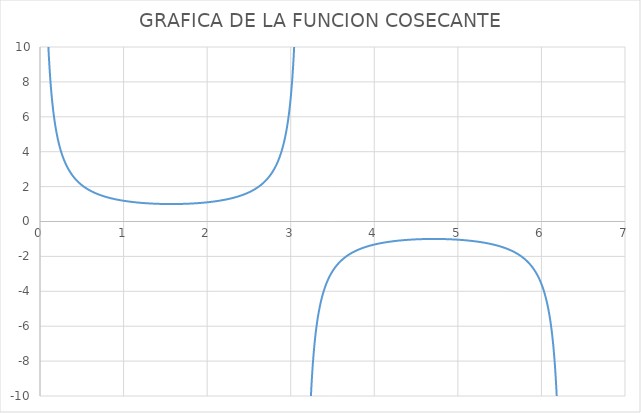
| Category | Series 0 |
|---|---|
| 0.017453292519943295 | 57.299 |
| 0.03490658503988659 | 28.654 |
| 0.05235987755982989 | 19.107 |
| 0.06981317007977318 | 14.336 |
| 0.08726646259971647 | 11.474 |
| 0.10471975511965978 | 9.567 |
| 0.12217304763960307 | 8.206 |
| 0.13962634015954636 | 7.185 |
| 0.15707963267948966 | 6.392 |
| 0.17453292519943295 | 5.759 |
| 0.19198621771937624 | 5.241 |
| 0.20943951023931956 | 4.81 |
| 0.22689280275926285 | 4.445 |
| 0.24434609527920614 | 4.134 |
| 0.2617993877991494 | 3.864 |
| 0.2792526803190927 | 3.628 |
| 0.29670597283903605 | 3.42 |
| 0.3141592653589793 | 3.236 |
| 0.33161255787892263 | 3.072 |
| 0.3490658503988659 | 2.924 |
| 0.3665191429188092 | 2.79 |
| 0.3839724354387525 | 2.669 |
| 0.4014257279586958 | 2.559 |
| 0.4188790204786391 | 2.459 |
| 0.4363323129985824 | 2.366 |
| 0.4537856055185257 | 2.281 |
| 0.47123889803846897 | 2.203 |
| 0.4886921905584123 | 2.13 |
| 0.5061454830783556 | 2.063 |
| 0.5235987755982988 | 2 |
| 0.5410520681182421 | 1.942 |
| 0.5585053606381855 | 1.887 |
| 0.5759586531581288 | 1.836 |
| 0.5934119456780721 | 1.788 |
| 0.6108652381980153 | 1.743 |
| 0.6283185307179586 | 1.701 |
| 0.6457718232379019 | 1.662 |
| 0.6632251157578453 | 1.624 |
| 0.6806784082777885 | 1.589 |
| 0.6981317007977318 | 1.556 |
| 0.7155849933176751 | 1.524 |
| 0.7330382858376184 | 1.494 |
| 0.7504915783575618 | 1.466 |
| 0.767944870877505 | 1.44 |
| 0.7853981633974483 | 1.414 |
| 0.8028514559173916 | 1.39 |
| 0.8203047484373349 | 1.367 |
| 0.8377580409572782 | 1.346 |
| 0.8552113334772214 | 1.325 |
| 0.8726646259971648 | 1.305 |
| 0.8901179185171081 | 1.287 |
| 0.9075712110370514 | 1.269 |
| 0.9250245035569946 | 1.252 |
| 0.9424777960769379 | 1.236 |
| 0.9599310885968813 | 1.221 |
| 0.9773843811168246 | 1.206 |
| 0.9948376736367679 | 1.192 |
| 1.0122909661567112 | 1.179 |
| 1.0297442586766545 | 1.167 |
| 1.0471975511965976 | 1.155 |
| 1.064650843716541 | 1.143 |
| 1.0821041362364843 | 1.133 |
| 1.0995574287564276 | 1.122 |
| 1.117010721276371 | 1.113 |
| 1.1344640137963142 | 1.103 |
| 1.1519173063162575 | 1.095 |
| 1.1693705988362009 | 1.086 |
| 1.1868238913561442 | 1.079 |
| 1.2042771838760873 | 1.071 |
| 1.2217304763960306 | 1.064 |
| 1.239183768915974 | 1.058 |
| 1.2566370614359172 | 1.051 |
| 1.2740903539558606 | 1.046 |
| 1.2915436464758039 | 1.04 |
| 1.3089969389957472 | 1.035 |
| 1.3264502315156905 | 1.031 |
| 1.3439035240356338 | 1.026 |
| 1.361356816555577 | 1.022 |
| 1.3788101090755203 | 1.019 |
| 1.3962634015954636 | 1.015 |
| 1.413716694115407 | 1.012 |
| 1.4311699866353502 | 1.01 |
| 1.4486232791552935 | 1.008 |
| 1.4660765716752369 | 1.006 |
| 1.4835298641951802 | 1.004 |
| 1.5009831567151235 | 1.002 |
| 1.5184364492350666 | 1.001 |
| 1.53588974175501 | 1.001 |
| 1.5533430342749532 | 1 |
| 1.5707963267948966 | 1 |
| 1.5882496193148399 | 1 |
| 1.6057029118347832 | 1.001 |
| 1.6231562043547265 | 1.001 |
| 1.6406094968746698 | 1.002 |
| 1.6580627893946132 | 1.004 |
| 1.6755160819145565 | 1.006 |
| 1.6929693744344996 | 1.008 |
| 1.710422666954443 | 1.01 |
| 1.7278759594743862 | 1.012 |
| 1.7453292519943295 | 1.015 |
| 1.7627825445142729 | 1.019 |
| 1.7802358370342162 | 1.022 |
| 1.7976891295541595 | 1.026 |
| 1.8151424220741028 | 1.031 |
| 1.8325957145940461 | 1.035 |
| 1.8500490071139892 | 1.04 |
| 1.8675022996339325 | 1.046 |
| 1.8849555921538759 | 1.051 |
| 1.9024088846738192 | 1.058 |
| 1.9198621771937625 | 1.064 |
| 1.9373154697137058 | 1.071 |
| 1.9547687622336491 | 1.079 |
| 1.9722220547535925 | 1.086 |
| 1.9896753472735358 | 1.095 |
| 2.007128639793479 | 1.103 |
| 2.0245819323134224 | 1.113 |
| 2.0420352248333655 | 1.122 |
| 2.059488517353309 | 1.133 |
| 2.076941809873252 | 1.143 |
| 2.0943951023931953 | 1.155 |
| 2.111848394913139 | 1.167 |
| 2.129301687433082 | 1.179 |
| 2.1467549799530254 | 1.192 |
| 2.1642082724729685 | 1.206 |
| 2.181661564992912 | 1.221 |
| 2.199114857512855 | 1.236 |
| 2.2165681500327987 | 1.252 |
| 2.234021442552742 | 1.269 |
| 2.251474735072685 | 1.287 |
| 2.2689280275926285 | 1.305 |
| 2.2863813201125716 | 1.325 |
| 2.303834612632515 | 1.346 |
| 2.321287905152458 | 1.367 |
| 2.3387411976724017 | 1.39 |
| 2.356194490192345 | 1.414 |
| 2.3736477827122884 | 1.44 |
| 2.3911010752322315 | 1.466 |
| 2.4085543677521746 | 1.494 |
| 2.426007660272118 | 1.524 |
| 2.443460952792061 | 1.556 |
| 2.4609142453120048 | 1.589 |
| 2.478367537831948 | 1.624 |
| 2.4958208303518914 | 1.662 |
| 2.5132741228718345 | 1.701 |
| 2.530727415391778 | 1.743 |
| 2.548180707911721 | 1.788 |
| 2.5656340004316642 | 1.836 |
| 2.5830872929516078 | 1.887 |
| 2.600540585471551 | 1.942 |
| 2.6179938779914944 | 2 |
| 2.6354471705114375 | 2.063 |
| 2.652900463031381 | 2.13 |
| 2.670353755551324 | 2.203 |
| 2.6878070480712677 | 2.281 |
| 2.705260340591211 | 2.366 |
| 2.722713633111154 | 2.459 |
| 2.7401669256310974 | 2.559 |
| 2.7576202181510405 | 2.669 |
| 2.775073510670984 | 2.79 |
| 2.792526803190927 | 2.924 |
| 2.8099800957108707 | 3.072 |
| 2.827433388230814 | 3.236 |
| 2.8448866807507573 | 3.42 |
| 2.8623399732707004 | 3.628 |
| 2.8797932657906435 | 3.864 |
| 2.897246558310587 | 4.134 |
| 2.91469985083053 | 4.445 |
| 2.9321531433504737 | 4.81 |
| 2.949606435870417 | 5.241 |
| 2.9670597283903604 | 5.759 |
| 2.9845130209103035 | 6.392 |
| 3.001966313430247 | 7.185 |
| 3.01941960595019 | 8.206 |
| 3.036872898470133 | 9.567 |
| 3.0543261909900767 | 11.474 |
| 3.07177948351002 | 14.336 |
| 3.0892327760299634 | 19.107 |
| 3.1066860685499065 | 28.654 |
| 3.12413936106985 | 57.299 |
| 3.141592653589793 | 8162276138809537 |
| 3.1590459461097367 | -57.299 |
| 3.1764992386296798 | -28.654 |
| 3.193952531149623 | -19.107 |
| 3.2114058236695664 | -14.336 |
| 3.2288591161895095 | -11.474 |
| 3.246312408709453 | -9.567 |
| 3.263765701229396 | -8.206 |
| 3.2812189937493397 | -7.185 |
| 3.2986722862692828 | -6.392 |
| 3.3161255787892263 | -5.759 |
| 3.3335788713091694 | -5.241 |
| 3.351032163829113 | -4.81 |
| 3.368485456349056 | -4.445 |
| 3.385938748868999 | -4.134 |
| 3.4033920413889427 | -3.864 |
| 3.420845333908886 | -3.628 |
| 3.4382986264288293 | -3.42 |
| 3.4557519189487724 | -3.236 |
| 3.473205211468716 | -3.072 |
| 3.490658503988659 | -2.924 |
| 3.5081117965086026 | -2.79 |
| 3.5255650890285457 | -2.669 |
| 3.543018381548489 | -2.559 |
| 3.5604716740684323 | -2.459 |
| 3.5779249665883754 | -2.366 |
| 3.595378259108319 | -2.281 |
| 3.612831551628262 | -2.203 |
| 3.6302848441482056 | -2.13 |
| 3.6477381366681487 | -2.063 |
| 3.6651914291880923 | -2 |
| 3.6826447217080354 | -1.942 |
| 3.7000980142279785 | -1.887 |
| 3.717551306747922 | -1.836 |
| 3.735004599267865 | -1.788 |
| 3.7524578917878086 | -1.743 |
| 3.7699111843077517 | -1.701 |
| 3.7873644768276953 | -1.662 |
| 3.8048177693476384 | -1.624 |
| 3.822271061867582 | -1.589 |
| 3.839724354387525 | -1.556 |
| 3.857177646907468 | -1.524 |
| 3.8746309394274117 | -1.494 |
| 3.8920842319473548 | -1.466 |
| 3.9095375244672983 | -1.44 |
| 3.9269908169872414 | -1.414 |
| 3.944444109507185 | -1.39 |
| 3.961897402027128 | -1.367 |
| 3.9793506945470716 | -1.346 |
| 3.9968039870670147 | -1.325 |
| 4.014257279586958 | -1.305 |
| 4.031710572106901 | -1.287 |
| 4.049163864626845 | -1.269 |
| 4.066617157146788 | -1.252 |
| 4.084070449666731 | -1.236 |
| 4.101523742186674 | -1.221 |
| 4.118977034706618 | -1.206 |
| 4.136430327226561 | -1.192 |
| 4.153883619746504 | -1.179 |
| 4.171336912266447 | -1.167 |
| 4.1887902047863905 | -1.155 |
| 4.2062434973063345 | -1.143 |
| 4.223696789826278 | -1.133 |
| 4.241150082346221 | -1.122 |
| 4.258603374866164 | -1.113 |
| 4.276056667386108 | -1.103 |
| 4.293509959906051 | -1.095 |
| 4.310963252425994 | -1.086 |
| 4.328416544945937 | -1.079 |
| 4.34586983746588 | -1.071 |
| 4.363323129985824 | -1.064 |
| 4.380776422505767 | -1.058 |
| 4.39822971502571 | -1.051 |
| 4.4156830075456535 | -1.046 |
| 4.4331363000655974 | -1.04 |
| 4.4505895925855405 | -1.035 |
| 4.468042885105484 | -1.031 |
| 4.485496177625427 | -1.026 |
| 4.50294947014537 | -1.022 |
| 4.520402762665314 | -1.019 |
| 4.537856055185257 | -1.015 |
| 4.5553093477052 | -1.012 |
| 4.572762640225143 | -1.01 |
| 4.590215932745087 | -1.008 |
| 4.60766922526503 | -1.006 |
| 4.625122517784973 | -1.004 |
| 4.642575810304916 | -1.002 |
| 4.6600291028248595 | -1.001 |
| 4.6774823953448035 | -1.001 |
| 4.694935687864747 | -1 |
| 4.71238898038469 | -1 |
| 4.729842272904633 | -1 |
| 4.747295565424577 | -1.001 |
| 4.76474885794452 | -1.001 |
| 4.782202150464463 | -1.002 |
| 4.799655442984406 | -1.004 |
| 4.817108735504349 | -1.006 |
| 4.834562028024293 | -1.008 |
| 4.852015320544236 | -1.01 |
| 4.869468613064179 | -1.012 |
| 4.886921905584122 | -1.015 |
| 4.904375198104066 | -1.019 |
| 4.9218284906240095 | -1.022 |
| 4.939281783143953 | -1.026 |
| 4.956735075663896 | -1.031 |
| 4.974188368183839 | -1.035 |
| 4.991641660703783 | -1.04 |
| 5.009094953223726 | -1.046 |
| 5.026548245743669 | -1.051 |
| 5.044001538263612 | -1.058 |
| 5.061454830783556 | -1.064 |
| 5.078908123303499 | -1.071 |
| 5.096361415823442 | -1.079 |
| 5.113814708343385 | -1.086 |
| 5.1312680008633285 | -1.095 |
| 5.1487212933832724 | -1.103 |
| 5.1661745859032155 | -1.113 |
| 5.183627878423159 | -1.122 |
| 5.201081170943102 | -1.133 |
| 5.218534463463046 | -1.143 |
| 5.235987755982989 | -1.155 |
| 5.253441048502932 | -1.167 |
| 5.270894341022875 | -1.179 |
| 5.288347633542818 | -1.192 |
| 5.305800926062762 | -1.206 |
| 5.323254218582705 | -1.221 |
| 5.340707511102648 | -1.236 |
| 5.358160803622591 | -1.252 |
| 5.375614096142535 | -1.269 |
| 5.3930673886624785 | -1.287 |
| 5.410520681182422 | -1.305 |
| 5.427973973702365 | -1.325 |
| 5.445427266222308 | -1.346 |
| 5.462880558742252 | -1.367 |
| 5.480333851262195 | -1.39 |
| 5.497787143782138 | -1.414 |
| 5.515240436302081 | -1.44 |
| 5.532693728822025 | -1.466 |
| 5.550147021341968 | -1.494 |
| 5.567600313861911 | -1.524 |
| 5.585053606381854 | -1.556 |
| 5.602506898901797 | -1.589 |
| 5.619960191421741 | -1.624 |
| 5.6374134839416845 | -1.662 |
| 5.654866776461628 | -1.701 |
| 5.672320068981571 | -1.743 |
| 5.689773361501515 | -1.788 |
| 5.707226654021458 | -1.836 |
| 5.724679946541401 | -1.887 |
| 5.742133239061344 | -1.942 |
| 5.759586531581287 | -2 |
| 5.777039824101231 | -2.063 |
| 5.794493116621174 | -2.13 |
| 5.811946409141117 | -2.203 |
| 5.82939970166106 | -2.281 |
| 5.846852994181004 | -2.366 |
| 5.8643062867009474 | -2.459 |
| 5.8817595792208905 | -2.559 |
| 5.899212871740834 | -2.669 |
| 5.916666164260777 | -2.79 |
| 5.934119456780721 | -2.924 |
| 5.951572749300664 | -3.072 |
| 5.969026041820607 | -3.236 |
| 5.98647933434055 | -3.42 |
| 6.003932626860494 | -3.628 |
| 6.021385919380437 | -3.864 |
| 6.03883921190038 | -4.134 |
| 6.056292504420323 | -4.445 |
| 6.073745796940266 | -4.81 |
| 6.09119908946021 | -5.241 |
| 6.1086523819801535 | -5.759 |
| 6.126105674500097 | -6.392 |
| 6.14355896702004 | -7.185 |
| 6.161012259539984 | -8.206 |
| 6.178465552059927 | -9.567 |
| 6.19591884457987 | -11.474 |
| 6.213372137099813 | -14.336 |
| 6.230825429619756 | -19.107 |
| 6.2482787221397 | -28.654 |
| 6.265732014659643 | -57.299 |
| 6.283185307179586 | -4081138069404768.5 |